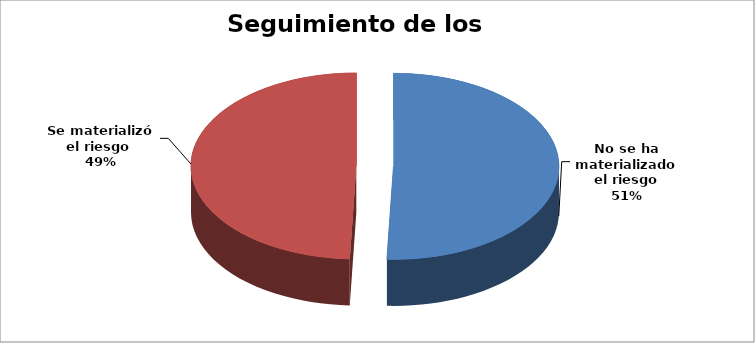
| Category | Series 0 |
|---|---|
| No se ha materializado el riesgo | 0.506 |
| Se materializó el riesgo  | 0.494 |